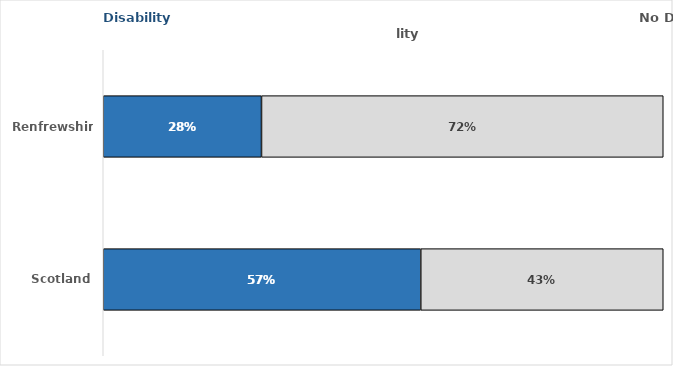
| Category | Disability | No Disability |
|---|---|---|
| Renfrewshire | 0.283 | 0.717 |
| Scotland | 0.567 | 0.433 |